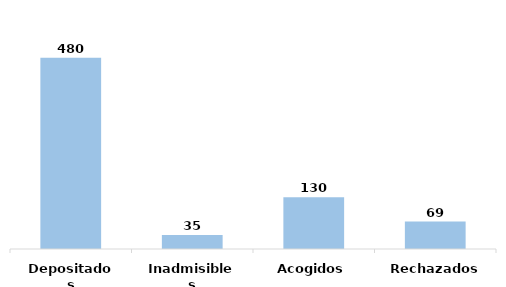
| Category | Series 0 |
|---|---|
| Depositados | 480 |
| Inadmisibles | 35 |
| Acogidos | 130 |
| Rechazados | 69 |